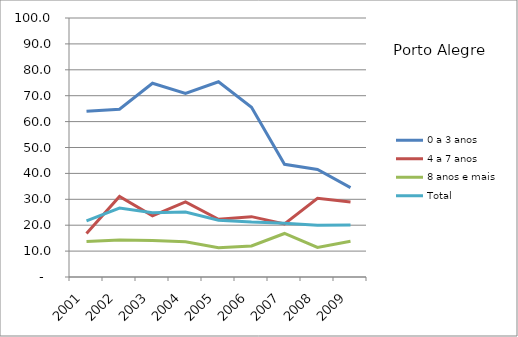
| Category | 0 a 3 anos | 4 a 7 anos | 8 anos e mais | Total |
|---|---|---|---|---|
| 2001.0 | 64 | 16.8 | 13.7 | 21.7 |
| 2002.0 | 64.8 | 31.1 | 14.3 | 26.6 |
| 2003.0 | 74.8 | 23.6 | 14.1 | 24.8 |
| 2004.0 | 70.9 | 29 | 13.6 | 25.1 |
| 2005.0 | 75.4 | 22.3 | 11.3 | 21.9 |
| 2006.0 | 65.5 | 23.3 | 12 | 21.2 |
| 2007.0 | 43.5 | 20.5 | 16.8 | 20.8 |
| 2008.0 | 41.5 | 30.4 | 11.4 | 20 |
| 2009.0 | 34.5 | 29 | 13.8 | 20.1 |